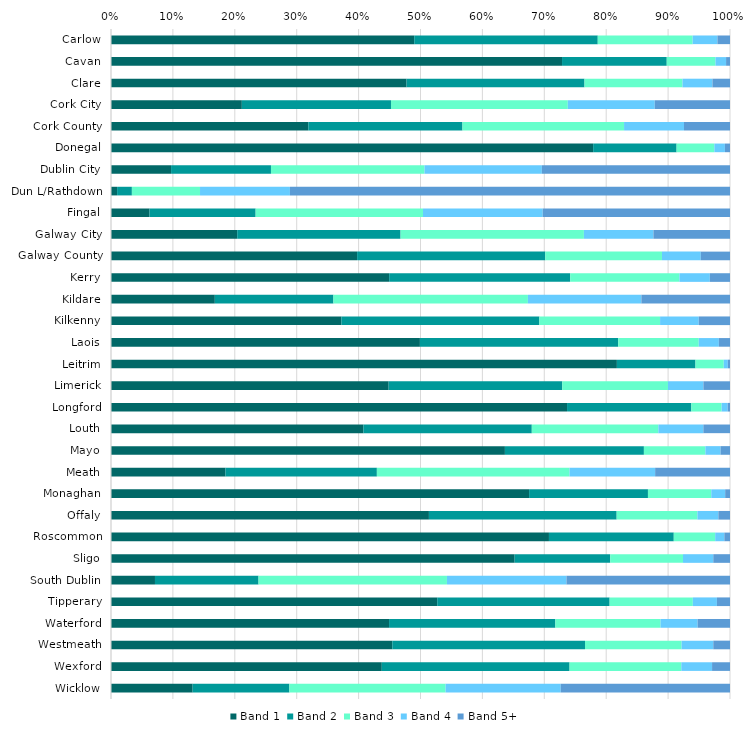
| Category | Band 1 | Band 2 | Band 3 | Band 4 | Band 5+ |
|---|---|---|---|---|---|
| Carlow | 0.49 | 0.296 | 0.153 | 0.04 | 0.02 |
| Cavan | 0.729 | 0.169 | 0.079 | 0.017 | 0.006 |
| Clare | 0.477 | 0.287 | 0.158 | 0.048 | 0.028 |
| Cork City | 0.211 | 0.241 | 0.286 | 0.14 | 0.122 |
| Cork County | 0.319 | 0.249 | 0.261 | 0.097 | 0.074 |
| Donegal | 0.779 | 0.135 | 0.061 | 0.017 | 0.008 |
| Dublin City | 0.097 | 0.161 | 0.248 | 0.19 | 0.304 |
| Dun L/Rathdown | 0.01 | 0.024 | 0.11 | 0.145 | 0.711 |
| Fingal | 0.062 | 0.171 | 0.27 | 0.193 | 0.303 |
| Galway City | 0.204 | 0.264 | 0.296 | 0.112 | 0.124 |
| Galway County | 0.398 | 0.304 | 0.189 | 0.063 | 0.047 |
| Kerry | 0.449 | 0.292 | 0.176 | 0.049 | 0.033 |
| Kildare | 0.168 | 0.192 | 0.314 | 0.183 | 0.143 |
| Kilkenny | 0.372 | 0.32 | 0.195 | 0.062 | 0.05 |
| Laois | 0.499 | 0.32 | 0.13 | 0.032 | 0.018 |
| Leitrim | 0.817 | 0.127 | 0.046 | 0.007 | 0.003 |
| Limerick | 0.449 | 0.28 | 0.171 | 0.057 | 0.043 |
| Longford | 0.737 | 0.201 | 0.049 | 0.01 | 0.004 |
| Louth | 0.408 | 0.272 | 0.204 | 0.073 | 0.043 |
| Mayo | 0.636 | 0.225 | 0.099 | 0.025 | 0.015 |
| Meath | 0.185 | 0.245 | 0.311 | 0.138 | 0.121 |
| Monaghan | 0.675 | 0.192 | 0.102 | 0.022 | 0.008 |
| Offaly | 0.514 | 0.303 | 0.13 | 0.034 | 0.019 |
| Roscommon | 0.708 | 0.202 | 0.067 | 0.015 | 0.009 |
| Sligo | 0.652 | 0.154 | 0.118 | 0.049 | 0.027 |
| South Dublin | 0.071 | 0.167 | 0.304 | 0.193 | 0.264 |
| Tipperary | 0.527 | 0.279 | 0.134 | 0.039 | 0.021 |
| Waterford | 0.449 | 0.269 | 0.17 | 0.06 | 0.052 |
| Westmeath | 0.454 | 0.311 | 0.156 | 0.051 | 0.027 |
| Wexford | 0.437 | 0.303 | 0.181 | 0.05 | 0.029 |
| Wicklow | 0.132 | 0.156 | 0.252 | 0.186 | 0.273 |